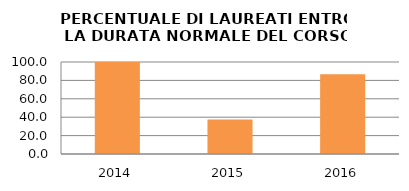
| Category | 2014 2015 2016 |
|---|---|
| 2014.0 | 100 |
| 2015.0 | 37.5 |
| 2016.0 | 86.667 |